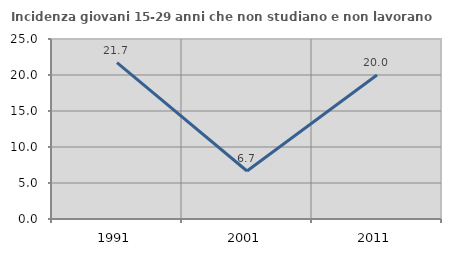
| Category | Incidenza giovani 15-29 anni che non studiano e non lavorano  |
|---|---|
| 1991.0 | 21.714 |
| 2001.0 | 6.667 |
| 2011.0 | 20 |